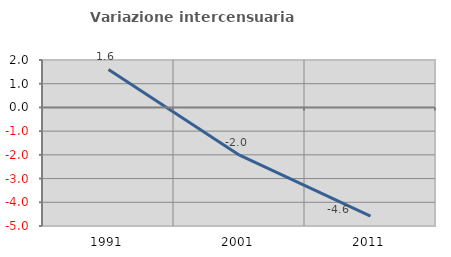
| Category | Variazione intercensuaria annua |
|---|---|
| 1991.0 | 1.601 |
| 2001.0 | -2.013 |
| 2011.0 | -4.587 |